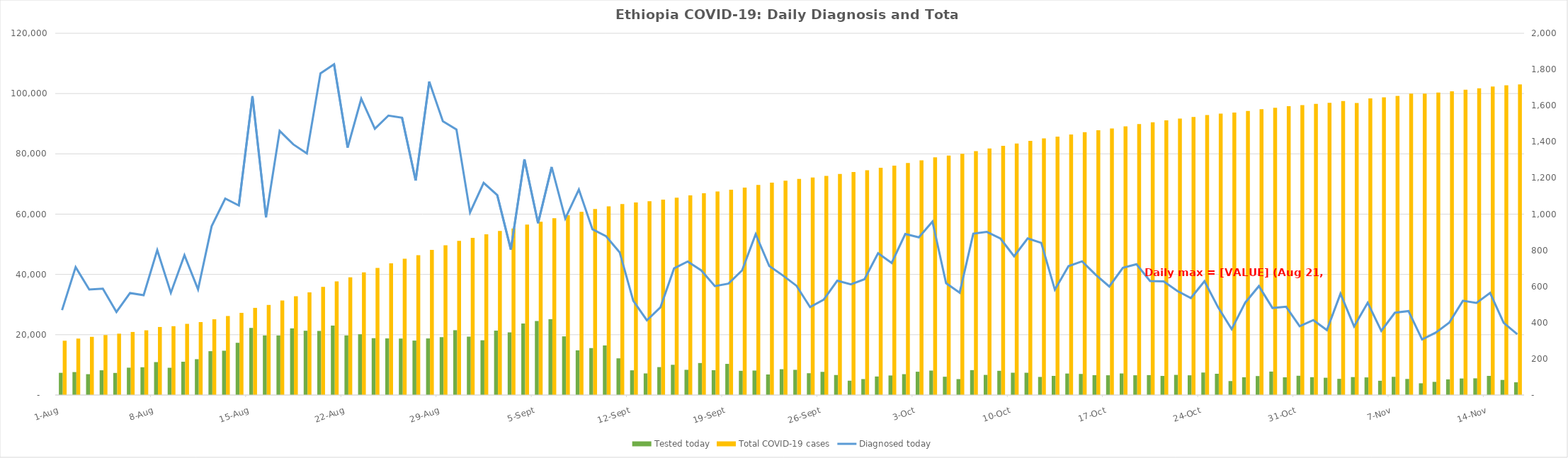
| Category | Tested today | Total COVID-19 cases |
|---|---|---|
| 2020-11-16 | 4213 | 103056 |
| 2020-11-15 | 5002 | 102720 |
| 2020-11-14 | 6343 | 102321 |
| 2020-11-13 | 5532 | 101757 |
| 2020-11-12 | 5478 | 101248 |
| 2020-11-11 | 5183 | 100727 |
| 2020-11-10 | 4360 | 100327 |
| 2020-11-09 | 3889 | 99982 |
| 2020-11-08 | 5324 | 99967 |
| 2020-11-07 | 6028 | 99201 |
| 2020-11-06 | 4725 | 98746 |
| 2020-11-05 | 5839 | 98391 |
| 2020-11-04 | 5945 | 96881 |
| 2020-11-03 | 5364 | 97502 |
| 2020-11-02 | 5726 | 96942 |
| 2020-11-01 | 5901 | 96583 |
| 2020-10-31 | 6386 | 96169 |
| 2020-10-30 | 5866 | 95789 |
| 2020-10-29 | 7773 | 95301 |
| 2020-10-28 | 6290 | 94820 |
| 2020-10-27 | 5884 | 94218 |
| 2020-10-26 | 4628 | 93707 |
| 2020-10-25 | 7045 | 93343 |
| 2020-10-24 | 7454 | 92858 |
| 2020-10-23 | 6538 | 92229 |
| 2020-10-22 | 6676 | 91693 |
| 2020-10-21 | 6333 | 91118 |
| 2020-10-20 | 6602 | 90490 |
| 2020-10-19 | 6546 | 89860 |
| 2020-10-18 | 7151 | 89137 |
| 2020-10-17 | 6548 | 88434 |
| 2020-10-16 | 6569 | 87834 |
| 2020-10-15 | 6985 | 87169 |
| 2020-10-14 | 7121 | 86430 |
| 2020-10-13 | 6344 | 85718 |
| 2020-10-12 | 5997 | 85136 |
| 2020-10-11 | 7383 | 84295 |
| 2020-10-10 | 7394 | 83429 |
| 2020-10-09 | 8024 | 82662 |
| 2020-10-08 | 6668 | 81797 |
| 2020-10-07 | 8254 | 80895 |
| 2020-10-06 | 5278 | 80003 |
| 2020-10-05 | 6062 | 79437 |
| 2020-10-04 | 8101 | 78819 |
| 2020-10-03 | 7726 | 77860 |
| 2020-10-02 | 6916 | 76988 |
| 2020-10-01 | 6475 | 76098 |
| 2020-09-30 | 6139 | 75368 |
| 2020-09-29 | 5284 | 74584 |
| 2020-09-28 | 4747 | 73994 |
| 2020-09-27 | 6631 | 73332 |
| 2020-09-26 | 7679 | 72700 |
| 2020-09-25 | 7227 | 72173 |
| 2020-09-24 | 8348 | 71687 |
| 2020-09-23 | 8551 | 71083 |
| 2020-09-22 | 6813 | 70422 |
| 2020-09-21 | 8115 | 69709 |
| 2020-09-20 | 8023 | 68820 |
| 2020-09-19 | 10322 | 68131 |
| 2020-09-18 | 8221 | 67515 |
| 2020-09-17 | 10605 | 66913 |
| 2020-09-16 | 8355 | 66224 |
| 2020-09-15 | 10024 | 65486 |
| 2020-09-14 | 9256 | 64786 |
| 2020-09-13 | 7162 | 64301 |
| 2020-09-12 | 8191 | 63888 |
| 2020-09-11 | 12164 | 63367 |
| 2020-09-10 | 16445 | 62578 |
| 2020-09-09 | 15561 | 61700 |
| 2020-09-08 | 14815 | 60784 |
| 2020-09-07 | 19449 | 59648 |
| 2020-09-06 | 25158 | 58672 |
| 2020-09-05 | 24544 | 57466 |
| 2020-09-04 | 23712 | 56526 |
| 2020-09-03 | 20778 | 55223 |
| 2020-09-02 | 21360 | 54409 |
| 2020-09-01 | 18160 | 53304 |
| 2020-08-31 | 19364 | 52131 |
| 2020-08-30 | 21499 | 51122 |
| 2020-08-29 | 19194 | 49654 |
| 2020-08-28 | 18766 | 48140 |
| 2020-08-27 | 18060 | 46407 |
| 2020-08-26 | 18724 | 45211 |
| 2020-08-25 | 18778 | 43698 |
| 2020-08-24 | 18851 | 42153 |
| 2020-08-23 | 20153 | 40681 |
| 2020-08-22 | 19766 | 39044 |
| 2020-08-21 | 23035 | 37675 |
| 2020-08-20 | 21256 | 35846 |
| 2020-08-19 | 21326 | 34058 |
| 2020-08-18 | 22101 | 32732 |
| 2020-08-17 | 19747 | 31346 |
| 2020-08-16 | 19767 | 29876 |
| 2020-08-15 | 22252 | 28904 |
| 2020-08-14 | 17323 | 27252 |
| 2020-08-13 | 14688 | 26204 |
| 2020-08-12 | 14540 | 25118 |
| 2020-08-11 | 11881 | 24185 |
| 2020-08-10 | 11039 | 23601 |
| 2020-08-09 | 9035 | 22828 |
| 2020-08-08 | 10919 | 22563 |
| 2020-08-07 | 9203 | 21462 |
| 2020-08-06 | 9068 | 20910 |
| 2020-08-05 | 7319 | 20346 |
| 2020-08-04 | 8201 | 19887 |
| 2020-08-03 | 6907 | 19299 |
| 2020-08-02 | 7607 | 18716 |
| 2020-08-01 | 7358 | 18009 |